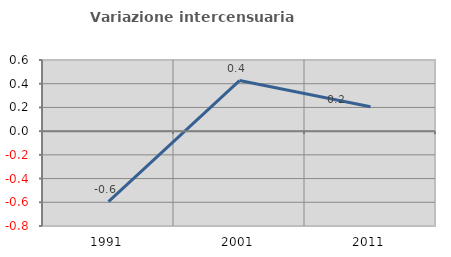
| Category | Variazione intercensuaria annua |
|---|---|
| 1991.0 | -0.594 |
| 2001.0 | 0.427 |
| 2011.0 | 0.206 |